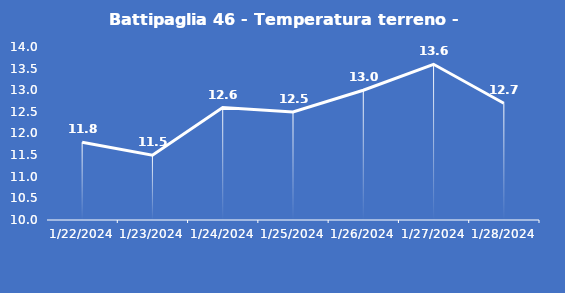
| Category | Battipaglia 46 - Temperatura terreno - Max (°C) |
|---|---|
| 1/22/24 | 11.8 |
| 1/23/24 | 11.5 |
| 1/24/24 | 12.6 |
| 1/25/24 | 12.5 |
| 1/26/24 | 13 |
| 1/27/24 | 13.6 |
| 1/28/24 | 12.7 |